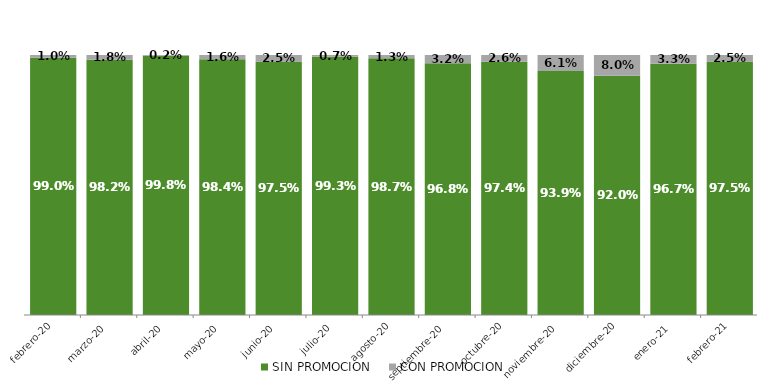
| Category | SIN PROMOCION   | CON PROMOCION   |
|---|---|---|
| 2020-02-01 | 0.99 | 0.01 |
| 2020-03-01 | 0.982 | 0.018 |
| 2020-04-01 | 0.998 | 0.002 |
| 2020-05-01 | 0.984 | 0.016 |
| 2020-06-01 | 0.975 | 0.025 |
| 2020-07-01 | 0.993 | 0.007 |
| 2020-08-01 | 0.987 | 0.013 |
| 2020-09-01 | 0.968 | 0.032 |
| 2020-10-01 | 0.974 | 0.026 |
| 2020-11-01 | 0.939 | 0.061 |
| 2020-12-01 | 0.92 | 0.08 |
| 2021-01-01 | 0.967 | 0.033 |
| 2021-02-01 | 0.975 | 0.025 |